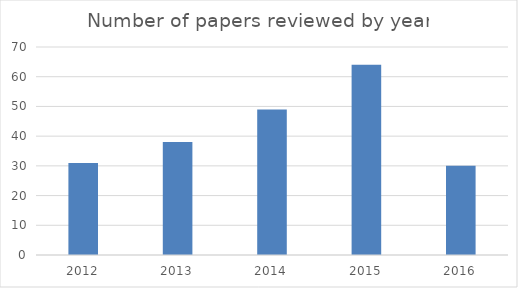
| Category | Series 0 |
|---|---|
| 2012.0 | 31 |
| 2013.0 | 38 |
| 2014.0 | 49 |
| 2015.0 | 64 |
| 2016.0 | 30 |